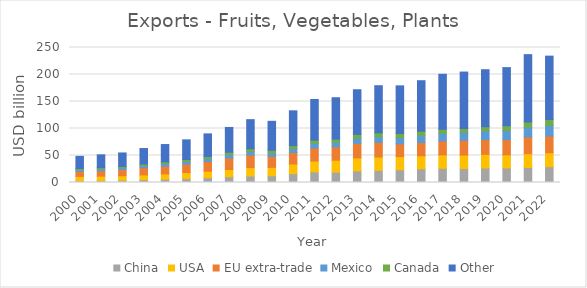
| Category | China | USA | EU extra-trade | Mexico | Canada | Other |
|---|---|---|---|---|---|---|
| 2000.0 | 3461.859 | 7938.971 | 9124.074 | 3255.569 | 2233.538 | 22372.211 |
| 2001.0 | 3830.431 | 7928.321 | 9860.154 | 3444.46 | 2386.481 | 23812.02 |
| 2002.0 | 4360.887 | 8169.099 | 11543.039 | 3383.506 | 2333.937 | 24935.463 |
| 2003.0 | 5198.889 | 8844.733 | 13403.403 | 4085.55 | 2705.262 | 28649.201 |
| 2004.0 | 6098.562 | 9800.295 | 14459.054 | 4721.483 | 3119.779 | 32104.771 |
| 2005.0 | 7202.909 | 11238.159 | 15643.152 | 5137.584 | 3379.021 | 36330.516 |
| 2006.0 | 8731.638 | 12159.955 | 17908.435 | 5693.795 | 3743.223 | 41802.025 |
| 2007.0 | 10563.619 | 13359.756 | 21457.648 | 6229.628 | 4394.536 | 45956.51 |
| 2008.0 | 11990.803 | 15552.595 | 23265.346 | 6571.326 | 5077.282 | 53935.012 |
| 2009.0 | 12445.496 | 15648.326 | 20082.801 | 6582.494 | 4952.733 | 53591.387 |
| 2010.0 | 16359.461 | 17828.816 | 21300.968 | 7454.901 | 5355.319 | 64446.456 |
| 2011.0 | 19680.468 | 20048.752 | 24160.368 | 8527.518 | 5877.821 | 75384.053 |
| 2012.0 | 19106.546 | 22126.628 | 24844.724 | 8558.108 | 5644.904 | 76691.767 |
| 2013.0 | 21546.513 | 24064.457 | 26853.098 | 9759.159 | 6786.054 | 82769.943 |
| 2014.0 | 22475.084 | 24678.576 | 27195.727 | 10517.123 | 7096.358 | 87264.148 |
| 2015.0 | 23581.473 | 24384.653 | 23511.977 | 11529.717 | 7652.613 | 88316.349 |
| 2016.0 | 25385.29 | 23995.773 | 24644.688 | 13323.676 | 7585.689 | 93547.042 |
| 2017.0 | 26190.086 | 24938.242 | 25669.345 | 14434.138 | 7355.403 | 101801.473 |
| 2018.0 | 25937.337 | 24774.893 | 27315.282 | 14893.79 | 7160.053 | 104420.767 |
| 2019.0 | 26851.369 | 25301.953 | 27248.984 | 16384.346 | 7519.327 | 105564.677 |
| 2020.0 | 26981.351 | 24203.923 | 28086.339 | 17002.624 | 8757.546 | 107722.499 |
| 2021.0 | 27769.35 | 25663.646 | 30694.384 | 18641.77 | 9307.444 | 124681.218 |
| 2022.0 | 29214.167 | 25873.368 | 30863.79 | 19892.126 | 10689.617 | 117466.641 |